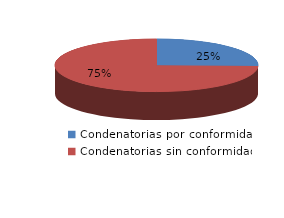
| Category | Series 0 |
|---|---|
| 0 | 83 |
| 1 | 244 |